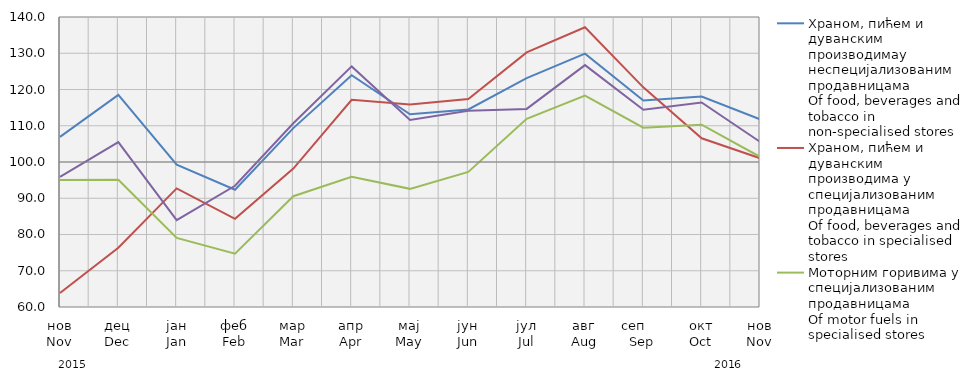
| Category | Храном, пићем и дуванским производимау неспецијализованим продавницама
Of food, beverages and tobacco in non-specialised stores
 | Храном, пићем и дуванским производима у специјализовaним продавницама
Of food, beverages and tobacco in specialised stores | Моторним горивима у специјализованим продавницама
Of motor fuels in specialised stores | Остала
Other |
|---|---|---|---|---|
| нов
Nov | 106.938 | 63.847 | 95.032 | 95.869 |
| дец
Dec | 118.498 | 76.368 | 95.084 | 105.475 |
| јан
Jan | 99.255 | 92.722 | 79.068 | 83.94 |
| феб
Feb | 92.363 | 84.339 | 74.7 | 93.451 |
| мар
Mar | 109.349 | 98.183 | 90.564 | 110.695 |
| апр
Apr | 123.935 | 117.147 | 95.897 | 126.373 |
| мај
May | 113.15 | 115.884 | 92.592 | 111.621 |
| јун
Jun | 114.503 | 117.373 | 97.274 | 114.134 |
| јул
Jul | 123.119 | 130.235 | 111.897 | 114.647 |
| авг
Aug | 129.897 | 137.173 | 118.321 | 126.728 |
| сеп     Sep | 116.954 | 120.599 | 109.459 | 114.395 |
| окт
Oct | 118.057 | 106.539 | 110.286 | 116.429 |
| нов
Nov | 111.772 | 101.038 | 101.435 | 105.563 |